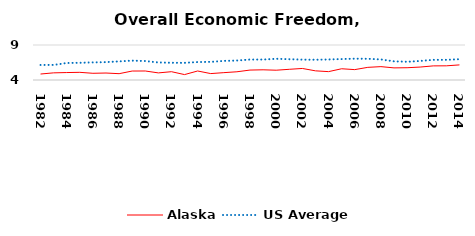
| Category | Alaska | US Average |
|---|---|---|
| 1982.0 | 4.854 | 6.149 |
| 1983.0 | 5.021 | 6.152 |
| 1984.0 | 5.063 | 6.429 |
| 1985.0 | 5.096 | 6.464 |
| 1986.0 | 4.959 | 6.512 |
| 1987.0 | 4.997 | 6.552 |
| 1988.0 | 4.904 | 6.659 |
| 1989.0 | 5.281 | 6.767 |
| 1990.0 | 5.287 | 6.71 |
| 1991.0 | 5.014 | 6.502 |
| 1992.0 | 5.187 | 6.463 |
| 1993.0 | 4.774 | 6.446 |
| 1994.0 | 5.288 | 6.563 |
| 1995.0 | 4.916 | 6.593 |
| 1996.0 | 5.051 | 6.73 |
| 1997.0 | 5.176 | 6.781 |
| 1998.0 | 5.419 | 6.926 |
| 1999.0 | 5.456 | 6.925 |
| 2000.0 | 5.397 | 7.031 |
| 2001.0 | 5.528 | 6.969 |
| 2002.0 | 5.647 | 6.912 |
| 2003.0 | 5.308 | 6.892 |
| 2004.0 | 5.195 | 6.934 |
| 2005.0 | 5.607 | 6.99 |
| 2006.0 | 5.483 | 7.048 |
| 2007.0 | 5.807 | 7.028 |
| 2008.0 | 5.91 | 6.935 |
| 2009.0 | 5.731 | 6.668 |
| 2010.0 | 5.754 | 6.605 |
| 2011.0 | 5.85 | 6.72 |
| 2012.0 | 6.017 | 6.883 |
| 2013.0 | 6.026 | 6.881 |
| 2014.0 | 6.158 | 6.973 |